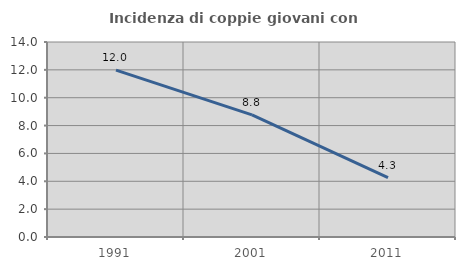
| Category | Incidenza di coppie giovani con figli |
|---|---|
| 1991.0 | 11.979 |
| 2001.0 | 8.769 |
| 2011.0 | 4.255 |